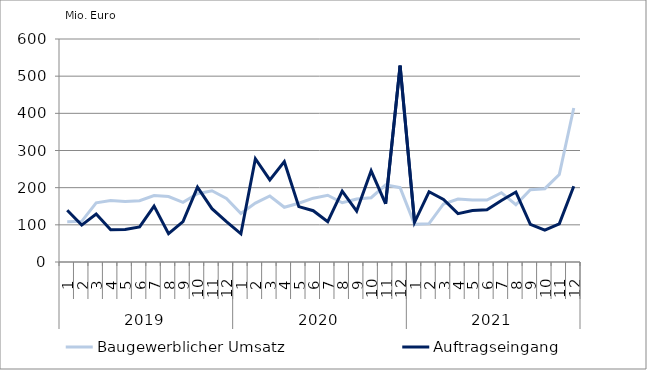
| Category | Baugewerblicher Umsatz | Auftragseingang |
|---|---|---|
| 0 | 108616.605 | 139065.287 |
| 1 | 109331.58 | 99318.609 |
| 2 | 159117.81 | 129002.041 |
| 3 | 165654.287 | 86579.2 |
| 4 | 162976.056 | 87644.362 |
| 5 | 165026.188 | 94463.186 |
| 6 | 178622.938 | 150345.08 |
| 7 | 176074.101 | 76434.317 |
| 8 | 160663.041 | 108444.162 |
| 9 | 183589.485 | 201122.697 |
| 10 | 191777.213 | 143514.792 |
| 11 | 170885.223 | 108780.022 |
| 12 | 130445.562 | 75891.481 |
| 13 | 158433.655 | 277923.85 |
| 14 | 177529.832 | 220973.626 |
| 15 | 147259.799 | 269936.091 |
| 16 | 157965.891 | 149072.895 |
| 17 | 171647.778 | 137984.76 |
| 18 | 179530.732 | 108645.965 |
| 19 | 159480.457 | 190771.468 |
| 20 | 169638.111 | 136988.906 |
| 21 | 173040.053 | 245341.603 |
| 22 | 207619.085 | 156647.224 |
| 23 | 199947.086 | 528166.004 |
| 24 | 101295.895 | 106850.127 |
| 25 | 103236.543 | 188883.434 |
| 26 | 156172.725 | 168204.42 |
| 27 | 169257.088 | 130052.073 |
| 28 | 166897.821 | 138492.214 |
| 29 | 166720.216 | 140262.426 |
| 30 | 186515.191 | 165331.191 |
| 31 | 154188.941 | 188169.655 |
| 32 | 194464.12 | 101359.538 |
| 33 | 197281.201 | 85626.862 |
| 34 | 235325.083 | 102880.924 |
| 35 | 414469.471 | 203900.676 |